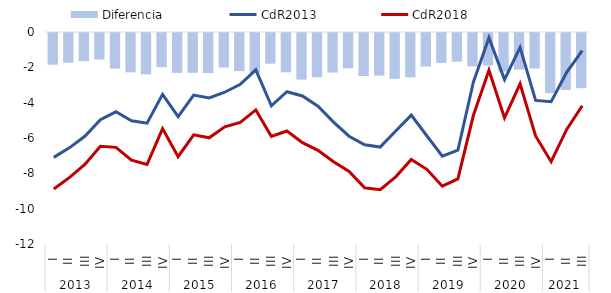
| Category | Diferencia |
|---|---|
| 0 | -1.793 |
| 1 | -1.683 |
| 2 | -1.593 |
| 3 | -1.499 |
| 4 | -2.014 |
| 5 | -2.228 |
| 6 | -2.339 |
| 7 | -1.936 |
| 8 | -2.259 |
| 9 | -2.254 |
| 10 | -2.263 |
| 11 | -1.956 |
| 12 | -2.159 |
| 13 | -2.266 |
| 14 | -1.734 |
| 15 | -2.224 |
| 16 | -2.639 |
| 17 | -2.502 |
| 18 | -2.239 |
| 19 | -1.998 |
| 20 | -2.435 |
| 21 | -2.41 |
| 22 | -2.596 |
| 23 | -2.506 |
| 24 | -1.9 |
| 25 | -1.698 |
| 26 | -1.624 |
| 27 | -1.89 |
| 28 | -1.841 |
| 29 | -2.173 |
| 30 | -2.067 |
| 31 | -2.012 |
| 32 | -3.395 |
| 33 | -3.229 |
| 34 | -3.121 |